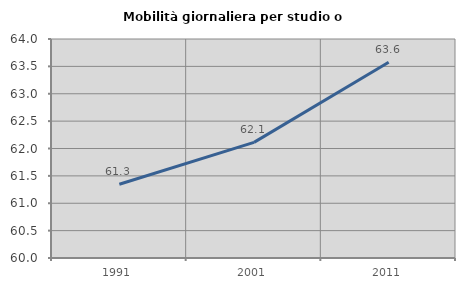
| Category | Mobilità giornaliera per studio o lavoro |
|---|---|
| 1991.0 | 61.347 |
| 2001.0 | 62.112 |
| 2011.0 | 63.577 |